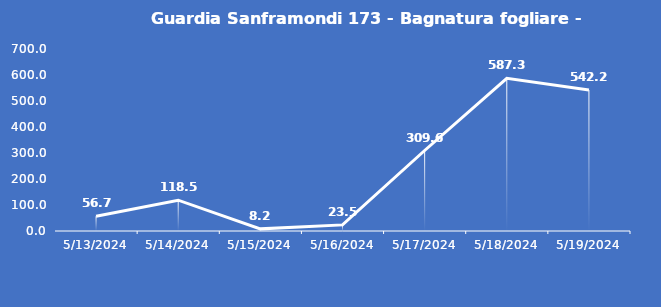
| Category | Guardia Sanframondi 173 - Bagnatura fogliare - Grezzo (min) |
|---|---|
| 5/13/24 | 56.7 |
| 5/14/24 | 118.5 |
| 5/15/24 | 8.2 |
| 5/16/24 | 23.5 |
| 5/17/24 | 309.6 |
| 5/18/24 | 587.3 |
| 5/19/24 | 542.2 |